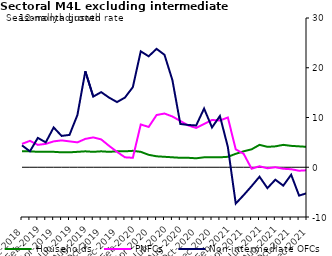
| Category | zero | Households | PNFCs | Non-intermediate OFCs |
|---|---|---|---|---|
| Dec-2018 | 0 | 3.2 | 4.7 | 4.4 |
| Jan-2019 | 0 | 3.2 | 5.3 | 3.2 |
| Feb-2019 | 0 | 3.1 | 4.5 | 5.9 |
| Mar-2019 | 0 | 3.1 | 4.7 | 5 |
| Apr-2019 | 0 | 3.1 | 5.2 | 8 |
| May-2019 | 0 | 3 | 5.4 | 6.3 |
| Jun-2019 | 0 | 3 | 5.2 | 6.5 |
| Jul-2019 | 0 | 3.1 | 5 | 10.5 |
| Aug-2019 | 0 | 3.2 | 5.7 | 19.3 |
| Sep-2019 | 0 | 3.1 | 6 | 14.2 |
| Oct-2019 | 0 | 3.2 | 5.6 | 15.1 |
| Nov-2019 | 0 | 3.1 | 4.3 | 14 |
| Dec-2019 | 0 | 3.2 | 3.1 | 13.1 |
| Jan-2020 | 0 | 3.2 | 2 | 14 |
| Feb-2020 | 0 | 3.3 | 1.9 | 16.1 |
| Mar-2020 | 0 | 3.1 | 8.6 | 23.3 |
| Apr-2020 | 0 | 2.5 | 8.1 | 22.3 |
| May-2020 | 0 | 2.2 | 10.5 | 23.8 |
| Jun-2020 | 0 | 2.1 | 10.8 | 22.6 |
| Jul-2020 | 0 | 2 | 10.2 | 17.5 |
| Aug-2020 | 0 | 1.9 | 9.3 | 8.7 |
| Sep-2020 | 0 | 1.9 | 8.4 | 8.5 |
| Oct-2020 | 0 | 1.8 | 7.9 | 8.4 |
| Nov-2020 | 0 | 2 | 8.7 | 11.8 |
| Dec-2020 | 0 | 2 | 9.5 | 8 |
| Jan-2021 | 0 | 2 | 9.4 | 10.3 |
| Feb-2021 | 0 | 2.1 | 10 | 4.1 |
| Mar-2021 | 0 | 2.7 | 3.6 | -7.3 |
| Apr-2021 | 0 | 3.2 | 2.7 | -5.6 |
| May-2021 | 0 | 3.6 | -0.3 | -3.8 |
| Jun-2021 | 0 | 4.5 | 0.2 | -1.9 |
| Jul-2021 | 0 | 4.1 | -0.2 | -4.2 |
| Aug-2021 | 0 | 4.2 | 0 | -2.5 |
| Sep-2021 | 0 | 4.5 | -0.3 | -3.7 |
| Oct-2021 | 0 | 4.3 | -0.4 | -1.5 |
| Nov-2021 | 0 | 4.2 | -0.7 | -5.7 |
| Dec-2021 | 0 | 4.1 | -0.6 | -5.2 |